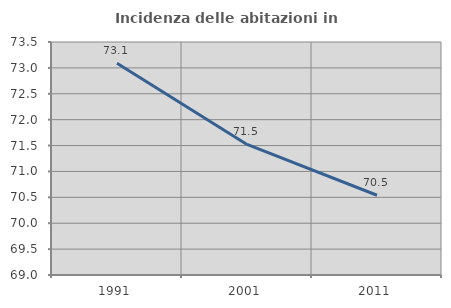
| Category | Incidenza delle abitazioni in proprietà  |
|---|---|
| 1991.0 | 73.09 |
| 2001.0 | 71.521 |
| 2011.0 | 70.54 |